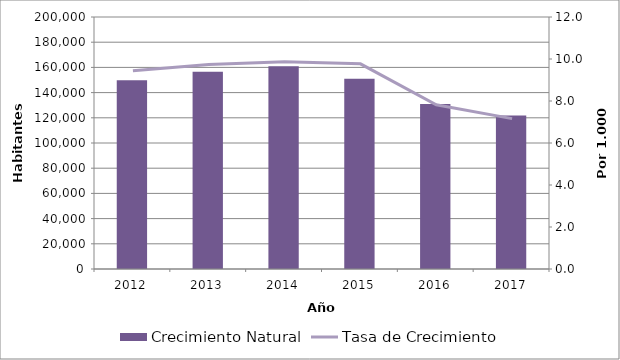
| Category | Crecimiento Natural |
|---|---|
| 2012 | 149746 |
| 2013 | 156464 |
| 2014 | 160885 |
| 2015 | 151034 |
| 2016 | 130987 |
| 2017 | 121863 |